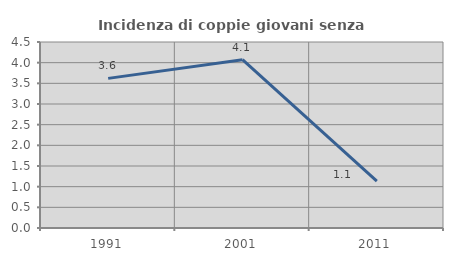
| Category | Incidenza di coppie giovani senza figli |
|---|---|
| 1991.0 | 3.62 |
| 2001.0 | 4.071 |
| 2011.0 | 1.136 |